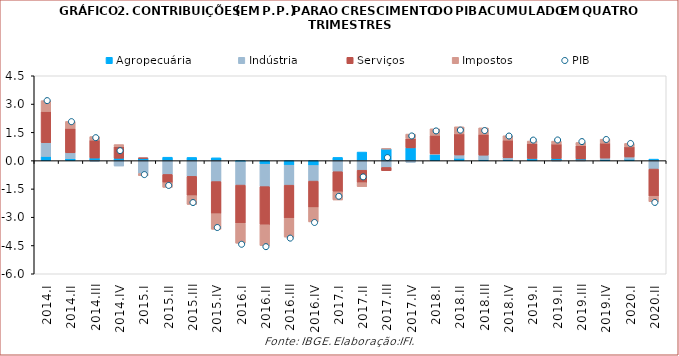
| Category | Agropecuária | Indústria | Serviços | Impostos |
|---|---|---|---|---|
| 2014.I | 0.223 | 0.73 | 1.654 | 0.574 |
| 2014.II | 0.099 | 0.315 | 1.297 | 0.368 |
| 2014.III | 0.139 | -0.035 | 0.95 | 0.189 |
| 2014.IV | 0.125 | -0.285 | 0.61 | 0.117 |
| 2015.I | 0.13 | -0.682 | 0.005 | -0.115 |
| 2015.II | 0.182 | -0.732 | -0.439 | -0.248 |
| 2015.III | 0.169 | -0.833 | -1.021 | -0.469 |
| 2015.IV | 0.149 | -1.11 | -1.702 | -0.83 |
| 2016.I | -0.059 | -1.237 | -2.025 | -1.059 |
| 2016.II | -0.189 | -1.189 | -2.022 | -1.109 |
| 2016.III | -0.241 | -1.061 | -1.753 | -1 |
| 2016.IV | -0.256 | -0.829 | -1.402 | -0.763 |
| 2017.I | 0.171 | -0.588 | -1.064 | -0.435 |
| 2017.II | 0.455 | -0.508 | -0.66 | -0.21 |
| 2017.III | 0.62 | -0.361 | -0.172 | 0.015 |
| 2017.IV | 0.676 | -0.092 | 0.484 | 0.249 |
| 2018.I | 0.322 | 0.036 | 0.984 | 0.346 |
| 2018.II | 0.124 | 0.175 | 1.12 | 0.375 |
| 2018.III | 0.059 | 0.232 | 1.104 | 0.343 |
| 2018.IV | 0.055 | 0.098 | 0.933 | 0.232 |
| 2019.I | 0.105 | 0.012 | 0.786 | 0.137 |
| 2019.II | 0.112 | -0.014 | 0.768 | 0.155 |
| 2019.III | 0.088 | -0.007 | 0.712 | 0.163 |
| 2019.IV | 0.056 | 0.081 | 0.791 | 0.208 |
| 2020.I | 0.075 | 0.118 | 0.538 | 0.184 |
| 2020.II | 0.08 | -0.447 | -1.442 | -0.295 |